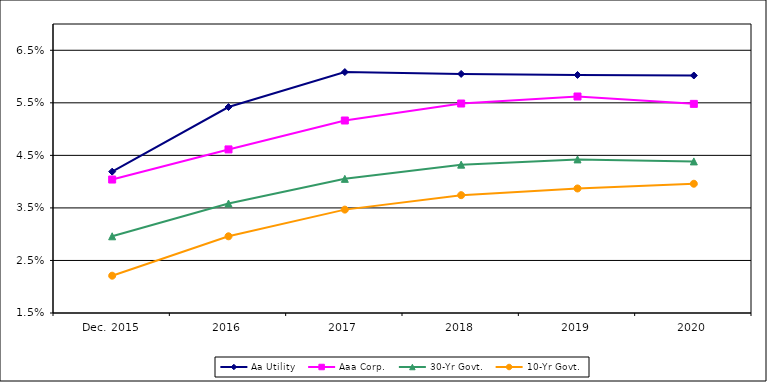
| Category | Aa Utility | Aaa Corp. | 30-Yr Govt. | 10-Yr Govt. |
|---|---|---|---|---|
| Dec. 2015 |  | 0.04 | 0.03 |  |
| 2016 |  | 0.046 | 0.036 |  |
| 2017 |  | 0.052 | 0.041 |  |
| 2018 |  | 0.055 | 0.043 |  |
| 2019 |  | 0.056 | 0.044 |  |
| 2020 |  | 0.055 | 0.044 |  |